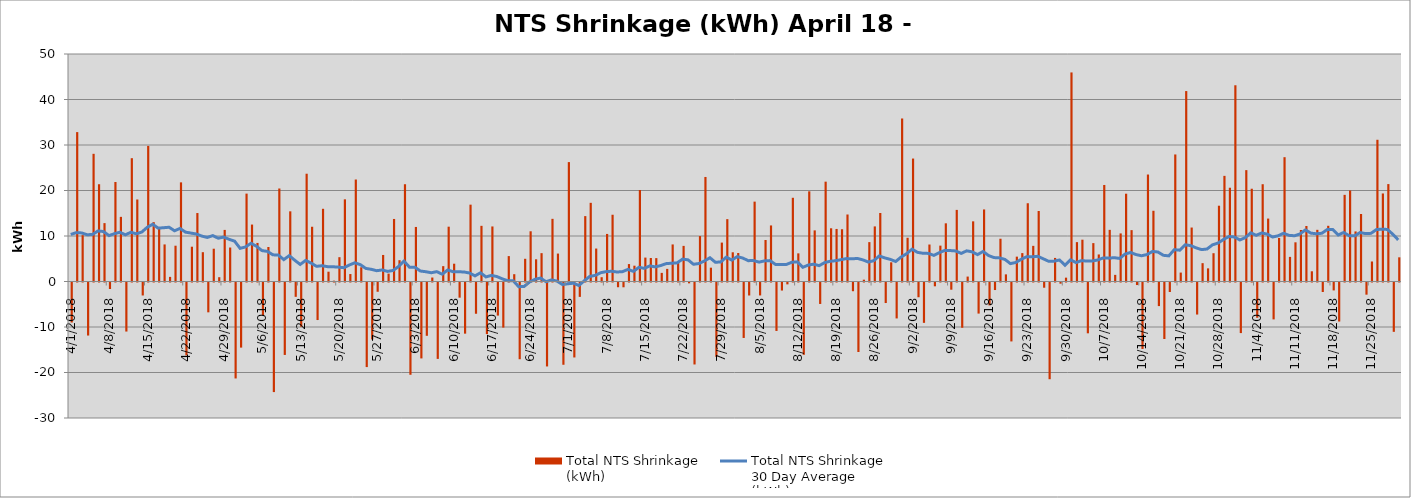
| Category | Total NTS Shrinkage
(kWh) |
|---|---|
| 4/1/18 | -8792530 |
| 4/2/18 | 32834545 |
| 4/3/18 | 10179991 |
| 4/4/18 | -11657593 |
| 4/5/18 | 28062721 |
| 4/6/18 | 21376540 |
| 4/7/18 | 12831044 |
| 4/8/18 | -1435382 |
| 4/9/18 | 21874602 |
| 4/10/18 | 14207387 |
| 4/11/18 | -10780226 |
| 4/12/18 | 27100684 |
| 4/13/18 | 18025390 |
| 4/14/18 | -2851554 |
| 4/15/18 | 29807993 |
| 4/16/18 | 13038217 |
| 4/17/18 | 11923369 |
| 4/18/18 | 8148474 |
| 4/19/18 | 1015356 |
| 4/20/18 | 7866046 |
| 4/21/18 | 21788290 |
| 4/22/18 | -16020216 |
| 4/23/18 | 7645514 |
| 4/24/18 | 15047579 |
| 4/25/18 | 6440771 |
| 4/26/18 | -6556387 |
| 4/27/18 | 7205433 |
| 4/28/18 | 945549 |
| 4/29/18 | 11339143 |
| 4/30/18 | 7467481 |
| 5/1/18 | -21088512 |
| 5/2/18 | -14309737 |
| 5/3/18 | 19314113 |
| 5/4/18 | 12513844 |
| 5/5/18 | 8476117 |
| 5/6/18 | -7231313 |
| 5/7/18 | 7584428 |
| 5/8/18 | -24085678 |
| 5/9/18 | 20438945 |
| 5/10/18 | -15920176 |
| 5/11/18 | 15421669 |
| 5/12/18 | -3150976 |
| 5/13/18 | -9720884 |
| 5/14/18 | 23687402 |
| 5/15/18 | 12031903 |
| 5/16/18 | -8251475 |
| 5/17/18 | 15979781 |
| 5/18/18 | 2153991 |
| 5/19/18 | 184363 |
| 5/20/18 | 5343752 |
| 5/21/18 | 18058094 |
| 5/22/18 | 1641055 |
| 5/23/18 | 22414349 |
| 5/24/18 | 3125869 |
| 5/25/18 | -18588789 |
| 5/26/18 | -12519348 |
| 5/27/18 | -2035233 |
| 5/28/18 | 5834420 |
| 5/29/18 | 1729932 |
| 5/30/18 | 13744297 |
| 5/31/18 | 4684604 |
| 6/1/18 | 21379042 |
| 6/2/18 | -20278760 |
| 6/3/18 | 11986756 |
| 6/4/18 | -16686667 |
| 6/5/18 | -11715027 |
| 6/6/18 | 872239 |
| 6/7/18 | -16791587 |
| 6/8/18 | 3376051 |
| 6/9/18 | 12048019 |
| 6/10/18 | 3911092 |
| 6/11/18 | -3335891 |
| 6/12/18 | -11243322 |
| 6/13/18 | 16888655 |
| 6/14/18 | -6868916 |
| 6/15/18 | 12234463 |
| 6/16/18 | -11335743 |
| 6/17/18 | 12097989 |
| 6/18/18 | -7272961 |
| 6/19/18 | -9910501 |
| 6/20/18 | 5584392 |
| 6/21/18 | 1604414 |
| 6/22/18 | -16865961 |
| 6/23/18 | 4991654 |
| 6/24/18 | 11036590 |
| 6/25/18 | 4880973 |
| 6/26/18 | 6230336 |
| 6/27/18 | -18451515 |
| 6/28/18 | 13772551 |
| 6/29/18 | 6140026 |
| 6/30/18 | -18080453 |
| 7/1/18 | 26241475 |
| 7/2/18 | -16474822 |
| 7/3/18 | -3160652 |
| 7/4/18 | 14371331 |
| 7/5/18 | 17290697 |
| 7/6/18 | 7242451 |
| 7/7/18 | 941301 |
| 7/8/18 | 10453916 |
| 7/9/18 | 14671011 |
| 7/10/18 | -1042026 |
| 7/11/18 | -1051272 |
| 7/12/18 | 3833283 |
| 7/13/18 | 3476910 |
| 7/14/18 | 20109509 |
| 7/15/18 | 5254840 |
| 7/16/18 | 5162329 |
| 7/17/18 | 5137844 |
| 7/18/18 | 1893712 |
| 7/19/18 | 2773134 |
| 7/20/18 | 8146507 |
| 7/21/18 | 4104264 |
| 7/22/18 | 7827355 |
| 7/23/18 | -184575 |
| 7/24/18 | -18015950 |
| 7/25/18 | 9986567 |
| 7/26/18 | 22976449 |
| 7/27/18 | 3037411 |
| 7/28/18 | -16343523 |
| 7/29/18 | 8550423 |
| 7/30/18 | 13703645 |
| 7/31/18 | 6421848 |
| 8/1/18 | 6258830 |
| 8/2/18 | -12188788 |
| 8/3/18 | -2855500 |
| 8/4/18 | 17554029 |
| 8/5/18 | -2845337 |
| 8/6/18 | 9120489 |
| 8/7/18 | 12320566 |
| 8/8/18 | -10645512 |
| 8/9/18 | -1767335 |
| 8/10/18 | -407770 |
| 8/11/18 | 18399787 |
| 8/12/18 | 6185348 |
| 8/13/18 | -15887183 |
| 8/14/18 | 19818877 |
| 8/15/18 | 11233864 |
| 8/16/18 | -4715098 |
| 8/17/18 | 21942572 |
| 8/18/18 | 11697655 |
| 8/19/18 | 11549996 |
| 8/20/18 | 11487185 |
| 8/21/18 | 14726911 |
| 8/22/18 | -1917939 |
| 8/23/18 | -15272931 |
| 8/24/18 | 399506 |
| 8/25/18 | 8655435 |
| 8/26/18 | 12107556 |
| 8/27/18 | 15056486 |
| 8/28/18 | -4513654 |
| 8/29/18 | 4216175 |
| 8/30/18 | -7897329 |
| 8/31/18 | 35826714 |
| 9/1/18 | 9608730 |
| 9/2/18 | 27022549 |
| 9/3/18 | -3240633 |
| 9/4/18 | -8869180 |
| 9/5/18 | 8126625 |
| 9/6/18 | -835503 |
| 9/7/18 | 7883601 |
| 9/8/18 | 12787875 |
| 9/9/18 | -1582848 |
| 9/10/18 | 15736286 |
| 9/11/18 | -9947753 |
| 9/12/18 | 1082880 |
| 9/13/18 | 13222377 |
| 9/14/18 | -6832433 |
| 9/15/18 | 15837461 |
| 9/16/18 | -5034067 |
| 9/17/18 | -1655632 |
| 9/18/18 | 9399716 |
| 9/19/18 | 1568137 |
| 9/20/18 | -12951900 |
| 9/21/18 | 5462340 |
| 9/22/18 | 6240296 |
| 9/23/18 | 17200996 |
| 9/24/18 | 7833984 |
| 9/25/18 | 15494095 |
| 9/26/18 | -1147991 |
| 9/27/18 | -21257782 |
| 9/28/18 | 5180946 |
| 9/29/18 | -255090 |
| 9/30/18 | 846703 |
| 10/1/18 | 45948300 |
| 10/2/18 | 8653339 |
| 10/3/18 | 9188847 |
| 10/4/18 | -11166997 |
| 10/5/18 | 8435426 |
| 10/6/18 | 5943948 |
| 10/7/18 | 21215707 |
| 10/8/18 | 11350171 |
| 10/9/18 | 1458014 |
| 10/10/18 | 10569147 |
| 10/11/18 | 19295146 |
| 10/12/18 | 11289663 |
| 10/13/18 | -559782 |
| 10/14/18 | -14605439 |
| 10/15/18 | 23511898 |
| 10/16/18 | 15543901 |
| 10/17/18 | -5185423 |
| 10/18/18 | -12417747 |
| 10/19/18 | -2087434 |
| 10/20/18 | 27921960 |
| 10/21/18 | 1960650 |
| 10/22/18 | 41854446 |
| 10/23/18 | 11861000 |
| 10/24/18 | -7043359 |
| 10/25/18 | 4031480 |
| 10/26/18 | 2888407 |
| 10/27/18 | 6217038 |
| 10/28/18 | 16657959 |
| 10/29/18 | 23217169 |
| 10/30/18 | 20609035 |
| 10/31/18 | 43128364 |
| 11/1/18 | -11118456 |
| 11/2/18 | 24476851 |
| 11/3/18 | 20388378 |
| 11/4/18 | -7745877 |
| 11/5/18 | 21380456 |
| 11/6/18 | 13830097 |
| 11/7/18 | -8109560 |
| 11/8/18 | 9573743 |
| 11/9/18 | 27321945 |
| 11/10/18 | 5409262 |
| 11/11/18 | 8613909 |
| 11/12/18 | 11319251 |
| 11/13/18 | 12198034 |
| 11/14/18 | 2244099 |
| 11/15/18 | 11358144 |
| 11/16/18 | -2083589 |
| 11/17/18 | 12242375 |
| 11/18/18 | -1740111 |
| 11/19/18 | -8573817 |
| 11/20/18 | 19043247 |
| 11/21/18 | 20002234 |
| 11/22/18 | 11004783 |
| 11/23/18 | 14837649 |
| 11/24/18 | -2675199 |
| 11/25/18 | 4397943 |
| 11/26/18 | 31148967 |
| 11/27/18 | 19347497 |
| 11/28/18 | 21411087 |
| 11/29/18 | -10843739 |
| 11/30/18 | 5315553 |